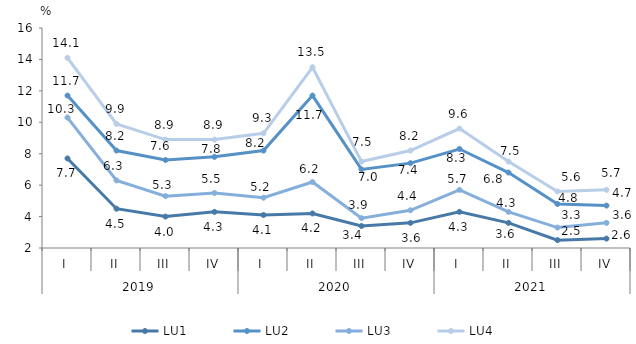
| Category | LU1 | LU2 | LU3 | LU4 |
|---|---|---|---|---|
| 0 | 7.7 | 11.7 | 10.3 | 14.1 |
| 1 | 4.5 | 8.2 | 6.3 | 9.9 |
| 2 | 4 | 7.6 | 5.3 | 8.9 |
| 3 | 4.3 | 7.8 | 5.5 | 8.9 |
| 4 | 4.1 | 8.2 | 5.2 | 9.3 |
| 5 | 4.2 | 11.7 | 6.2 | 13.5 |
| 6 | 3.4 | 7 | 3.9 | 7.5 |
| 7 | 3.6 | 7.4 | 4.4 | 8.2 |
| 8 | 4.3 | 8.3 | 5.7 | 9.6 |
| 9 | 3.6 | 6.8 | 4.3 | 7.5 |
| 10 | 2.5 | 4.8 | 3.3 | 5.6 |
| 11 | 2.6 | 4.7 | 3.6 | 5.7 |